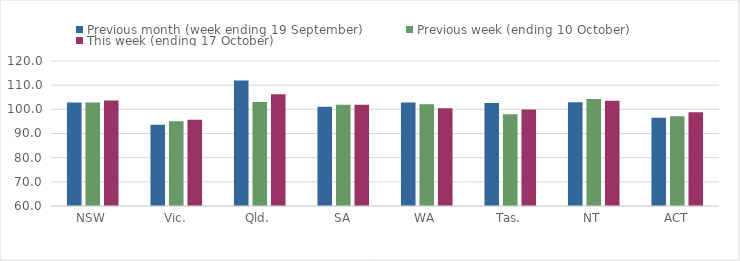
| Category | Previous month (week ending 19 September) | Previous week (ending 10 October) | This week (ending 17 October) |
|---|---|---|---|
| NSW | 102.79 | 102.82 | 103.63 |
| Vic. | 93.62 | 95.03 | 95.74 |
| Qld. | 111.91 | 103.07 | 106.21 |
| SA | 101.08 | 101.86 | 101.86 |
| WA | 102.83 | 102.07 | 100.42 |
| Tas. | 102.64 | 97.99 | 99.89 |
| NT | 102.88 | 104.25 | 103.58 |
| ACT | 96.55 | 97.18 | 98.78 |